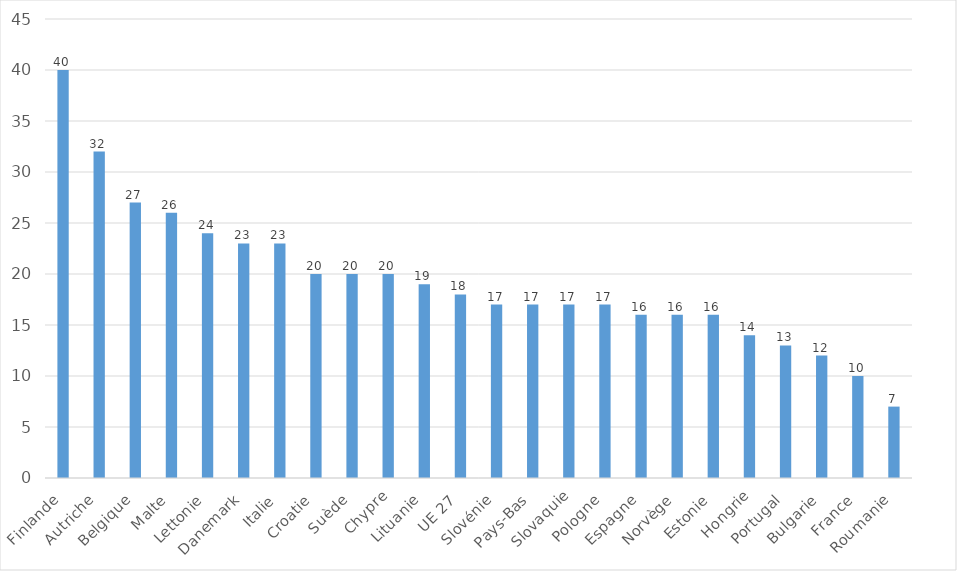
| Category | Utilisation des systèmes interconnectés |
|---|---|
| Finlande | 40 |
| Autriche | 32 |
| Belgique | 27 |
| Malte | 26 |
| Lettonie | 24 |
| Danemark | 23 |
| Italie | 23 |
| Croatie | 20 |
| Suède | 20 |
| Chypre | 20 |
| Lituanie | 19 |
| UE 27 | 18 |
| Slovénie | 17 |
| Pays-Bas | 17 |
| Slovaquie | 17 |
| Pologne | 17 |
| Espagne | 16 |
| Norvège | 16 |
| Estonie | 16 |
| Hongrie | 14 |
| Portugal | 13 |
| Bulgarie | 12 |
| France | 10 |
| Roumanie | 7 |